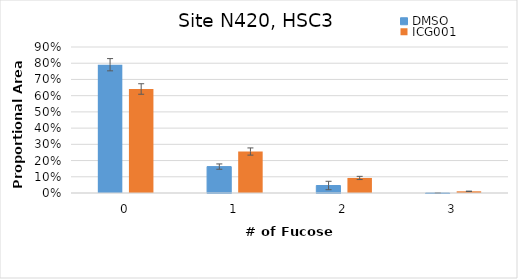
| Category | DMSO | ICG001 |
|---|---|---|
| 0 | 0.791 | 0.641 |
| 1 | 0.163 | 0.256 |
| 2 | 0.046 | 0.093 |
| 3 | 0 | 0.01 |